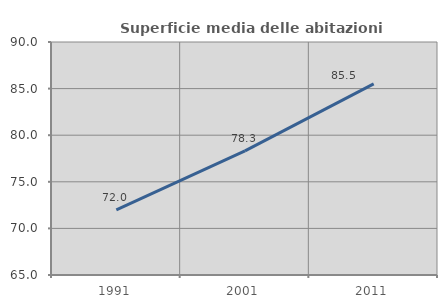
| Category | Superficie media delle abitazioni occupate |
|---|---|
| 1991.0 | 71.981 |
| 2001.0 | 78.326 |
| 2011.0 | 85.499 |